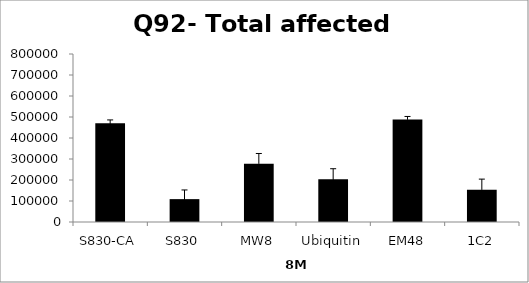
| Category | Series 0 |
|---|---|
| S830-CA | 470587.295 |
| S830 | 108920.194 |
| MW8 | 277822.846 |
| Ubiquitin | 204037.119 |
| EM48 | 487886.029 |
| 1C2 | 153323.465 |